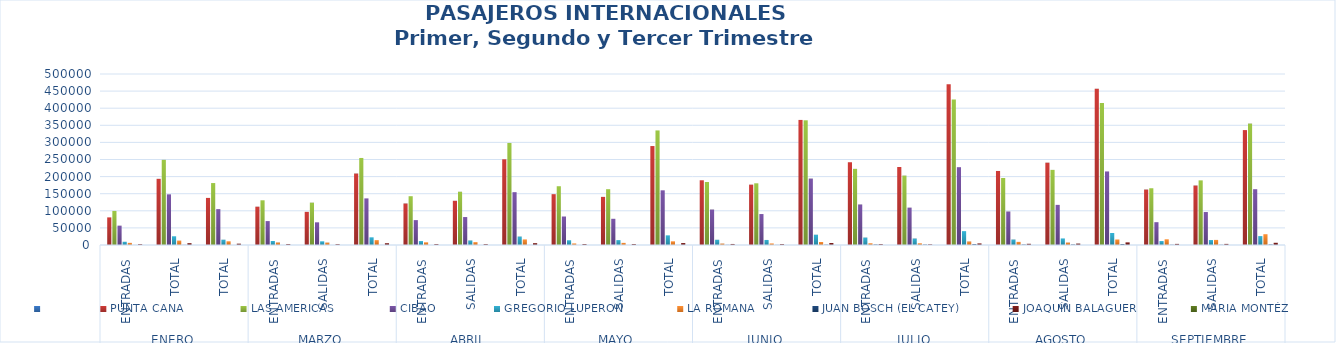
| Category | Series 0 | PUNTA CANA | LAS AMERICAS | CIBAO | GREGORIO LUPERON | LA ROMANA | JUAN BOSCH (EL CATEY) | JOAQUÍN BALAGUER | MARIA MONTÉZ |
|---|---|---|---|---|---|---|---|---|---|
| 0 |  | 80766 | 99599 | 56459 | 9387 | 6229 | 101 | 2444 | 1 |
| 1 |  | 193484 | 248929 | 148126 | 25516 | 12652 | 401 | 5396 | 1 |
| 2 |  | 137678 | 181138 | 104888 | 15450 | 10848 | 89 | 3876 | 9 |
| 3 |  | 112019 | 130720 | 69918 | 11685 | 7250 | 85 | 2782 | 10 |
| 4 |  | 96923 | 123770 | 66368 | 10789 | 6983 | 74 | 2452 | 7 |
| 5 |  | 208942 | 254490 | 136286 | 22474 | 14233 | 159 | 5234 | 17 |
| 6 |  | 121328 | 142669 | 72778 | 11533 | 7945 | 64 | 2763 | 1 |
| 7 |  | 129274 | 155709 | 81719 | 13054 | 8377 | 68 | 2626 | 2 |
| 8 |  | 250602 | 298378 | 154497 | 24587 | 16322 | 132 | 5389 | 3 |
| 9 |  | 148641 | 171850 | 83336 | 13914 | 4624 | 70 | 2864 | 4 |
| 10 |  | 140691 | 163171 | 76568 | 14335 | 6176 | 75 | 2851 | 5 |
| 11 |  | 289332 | 335021 | 159904 | 28249 | 10800 | 145 | 5715 | 9 |
| 12 |  | 189262 | 184184 | 103620 | 15266 | 4128 | 521 | 3030 | 3 |
| 13 |  | 176433 | 180423 | 90512 | 14754 | 4590 | 364 | 2758 | 2 |
| 14 |  | 365695 | 364607 | 194132 | 30020 | 8718 | 885 | 5788 | 5 |
| 15 |  | 242002 | 222633 | 118360 | 21651 | 5116 | 1349 | 2740 | 4 |
| 16 |  | 228051 | 202824 | 109189 | 18858 | 5013 | 1150 | 1954 | 2 |
| 17 |  | 470053 | 425457 | 227549 | 40509 | 10129 | 2499 | 4694 | 6 |
| 18 |  | 216475 | 195866 | 97788 | 15870 | 9106 | 1279 | 3539 | 0 |
| 19 |  | 240713 | 219625 | 117293 | 19223 | 7059 | 1397 | 4167 | 0 |
| 20 |  | 457188 | 415491 | 215081 | 35093 | 16165 | 2676 | 7706 | 0 |
| 21 |  | 162130 | 165953 | 66736 | 11533 | 16714 | 708 | 3254 | 0 |
| 22 |  | 173866 | 189006 | 96390 | 14519 | 14859 | 646 | 3236 | 0 |
| 23 |  | 335996 | 354959 | 163126 | 26052 | 31573 | 1354 | 6490 | 0 |